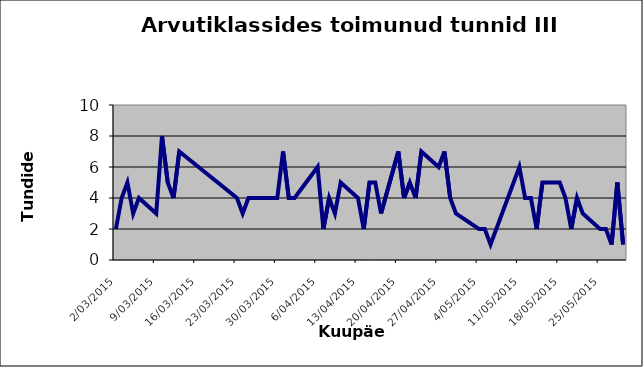
| Category | Series 0 |
|---|---|
| 2015-03-02 | 2 |
| 2015-03-03 | 4 |
| 2015-03-04 | 5 |
| 2015-03-05 | 3 |
| 2015-03-06 | 4 |
| 2015-03-09 | 3 |
| 2015-03-10 | 8 |
| 2015-03-11 | 5 |
| 2015-03-12 | 4 |
| 2015-03-13 | 7 |
| 2015-03-23 | 4 |
| 2015-03-24 | 3 |
| 2015-03-25 | 4 |
| 2015-03-26 | 4 |
| 2015-03-27 | 4 |
| 2015-03-30 | 4 |
| 2015-03-31 | 7 |
| 2015-04-01 | 4 |
| 2015-04-02 | 4 |
| 2015-04-06 | 6 |
| 2015-04-07 | 2 |
| 2015-04-08 | 4 |
| 2015-04-09 | 3 |
| 2015-04-10 | 5 |
| 2015-04-13 | 4 |
| 2015-04-14 | 2 |
| 2015-04-15 | 5 |
| 2015-04-16 | 5 |
| 2015-04-17 | 3 |
| 2015-04-20 | 7 |
| 2015-04-21 | 4 |
| 2015-04-22 | 5 |
| 2015-04-23 | 4 |
| 2015-04-24 | 7 |
| 2015-04-27 | 6 |
| 2015-04-28 | 7 |
| 2015-04-29 | 4 |
| 2015-04-30 | 3 |
| 2015-05-04 | 2 |
| 2015-05-05 | 2 |
| 2015-05-06 | 1 |
| 2015-05-07 | 2 |
| 2015-05-08 | 3 |
| 2015-05-11 | 6 |
| 2015-05-12 | 4 |
| 2015-05-13 | 4 |
| 2015-05-14 | 2 |
| 2015-05-15 | 5 |
| 2015-05-18 | 5 |
| 2015-05-19 | 4 |
| 2015-05-20 | 2 |
| 2015-05-21 | 4 |
| 2015-05-22 | 3 |
| 2015-05-25 | 2 |
| 2015-05-26 | 2 |
| 2015-05-27 | 1 |
| 2015-05-28 | 5 |
| 2015-05-29 | 1 |